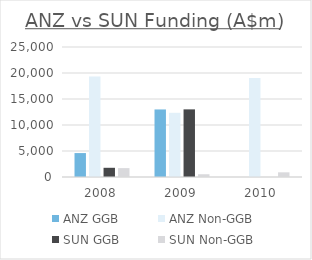
| Category | ANZ | SUN |
|---|---|---|
| 2008.0 | 19336.35 | 1706.685 |
| 2009.0 | 12344.407 | 530.19 |
| 2010.0 | 19060.268 | 900 |